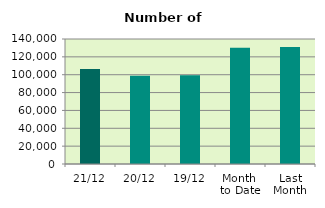
| Category | Series 0 |
|---|---|
| 21/12 | 106284 |
| 20/12 | 98838 |
| 19/12 | 99500 |
| Month 
to Date | 130220.533 |
| Last
Month | 131016.636 |